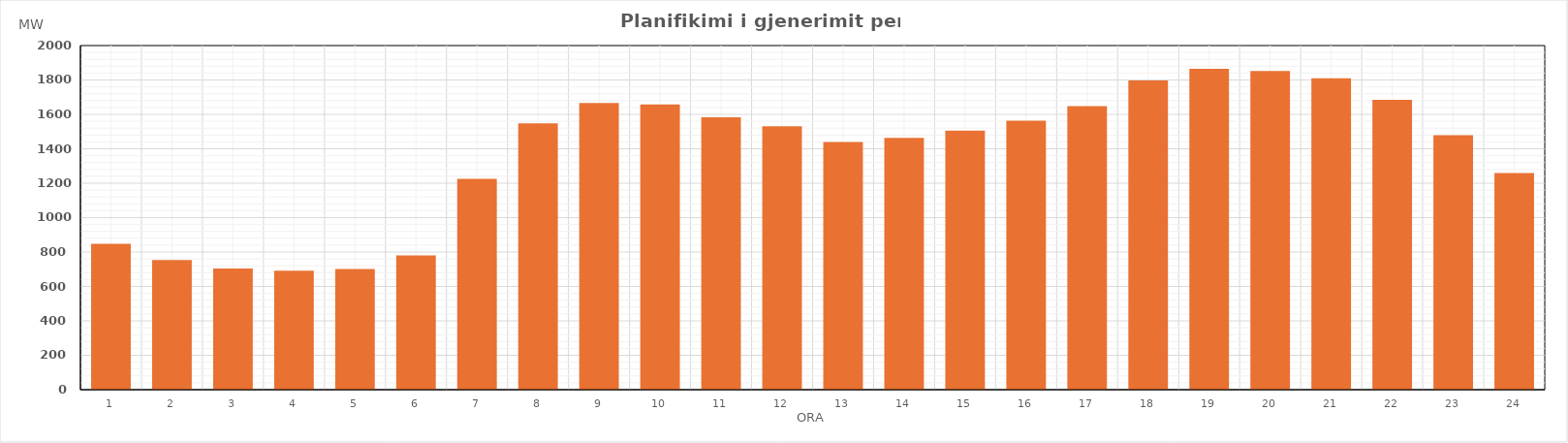
| Category | Max (MW) |
|---|---|
| 0 | 847.7 |
| 1 | 752.9 |
| 2 | 704.88 |
| 3 | 691.29 |
| 4 | 701.07 |
| 5 | 780.96 |
| 6 | 1225.69 |
| 7 | 1547.8 |
| 8 | 1666.28 |
| 9 | 1657.42 |
| 10 | 1583.47 |
| 11 | 1530.88 |
| 12 | 1439.59 |
| 13 | 1463.37 |
| 14 | 1505.71 |
| 15 | 1562.78 |
| 16 | 1647.75 |
| 17 | 1797.45 |
| 18 | 1864.15 |
| 19 | 1852.06 |
| 20 | 1810.43 |
| 21 | 1683.82 |
| 22 | 1478.62 |
| 23 | 1258.54 |